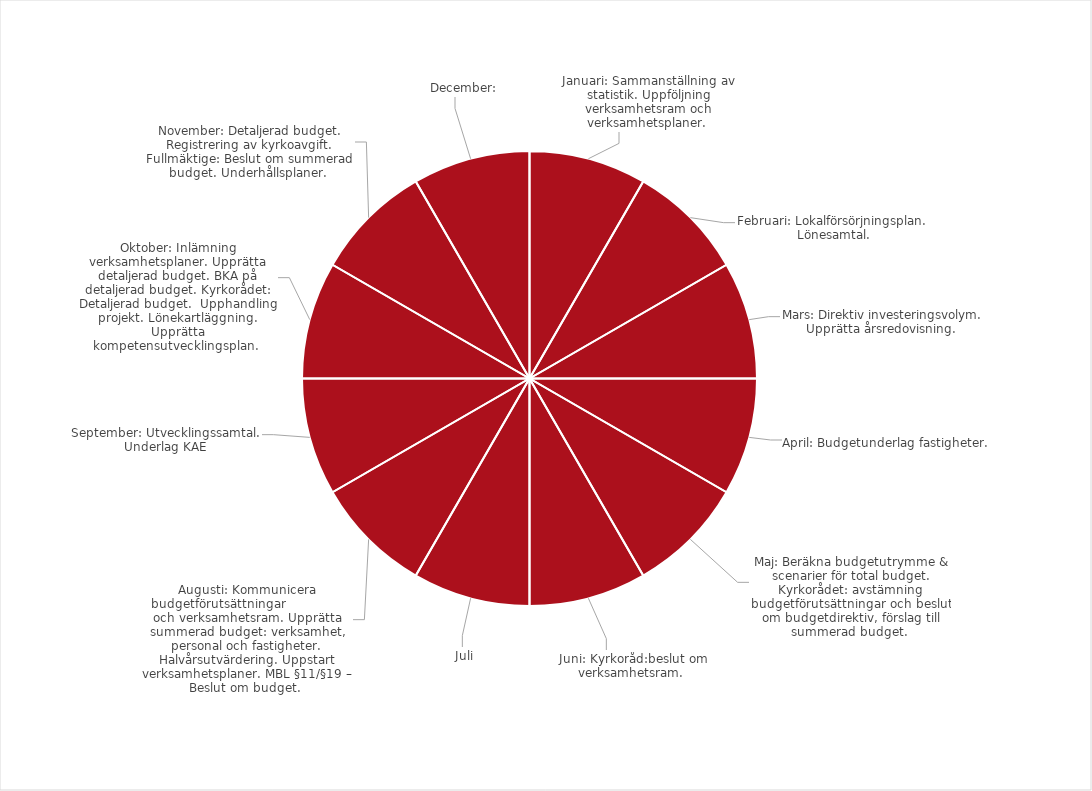
| Category | Series 0 |
|---|---|
| Januari: Sammanställning av statistik. Uppföljning verksamhetsram och verksamhetsplaner.  | 1 |
| Februari: Lokalförsörjningsplan.  Lönesamtal.


 | 1 |
| Mars: Direktiv investeringsvolym. Upprätta årsredovisning.  | 1 |
| April: Budgetunderlag fastigheter.  | 1 |
| Maj: Beräkna budgetutrymme & scenarier för total budget. Kyrkorådet: avstämning budgetförutsättningar och beslut om budgetdirektiv, förslag till summerad budget.  | 1 |
| Juni: Kyrkoråd:beslut om
verksamhetsram.  | 1 |
| Juli | 1 |
| Augusti: Kommunicera budgetförutsättningar                och verksamhetsram. Upprätta summerad budget: verksamhet, personal och fastigheter. Halvårsutvärdering. Uppstart verksamhetsplaner. MBL §11/§19 – Beslut om budget.  | 1 |
| September: Utvecklingssamtal. Underlag KAE | 1 |
| Oktober: Inlämning verksamhetsplaner. Upprätta detaljerad budget. BKA på detaljerad budget. Kyrkorådet: Detaljerad budget.  Upphandling projekt. Lönekartläggning. Upprätta kompetensutvecklingsplan.  | 1 |
| November: Detaljerad budget. Registrering av kyrkoavgift. Fullmäktige: Beslut om summerad budget. Underhållsplaner.  | 1 |
| December:  | 1 |